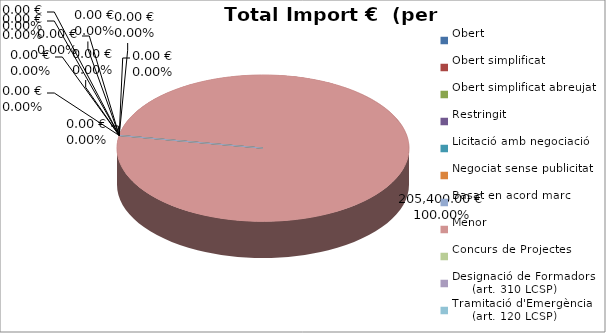
| Category | Total preu
(amb IVA) |
|---|---|
| Obert | 0 |
| Obert simplificat | 0 |
| Obert simplificat abreujat | 0 |
| Restringit | 0 |
| Licitació amb negociació | 0 |
| Negociat sense publicitat | 0 |
| Basat en acord marc | 0 |
| Menor | 205400 |
| Concurs de Projectes | 0 |
| Designació de Formadors
     (art. 310 LCSP) | 0 |
| Tramitació d'Emergència
     (art. 120 LCSP) | 0 |